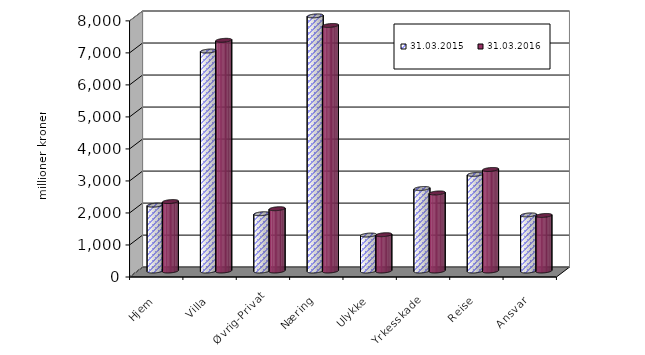
| Category | 31.03.2015 | 31.03.2016 |
|---|---|---|
| Hjem | 2057.145 | 2168.852 |
| Villa | 6870.848 | 7205.664 |
| Øvrig-Privat | 1789.173 | 1945.582 |
| Næring | 7968.781 | 7668.993 |
| Ulykke | 1123.034 | 1133.989 |
| Yrkesskade | 2576.987 | 2438.5 |
| Reise | 3018.194 | 3171.493 |
| Ansvar | 1752.283 | 1734.875 |